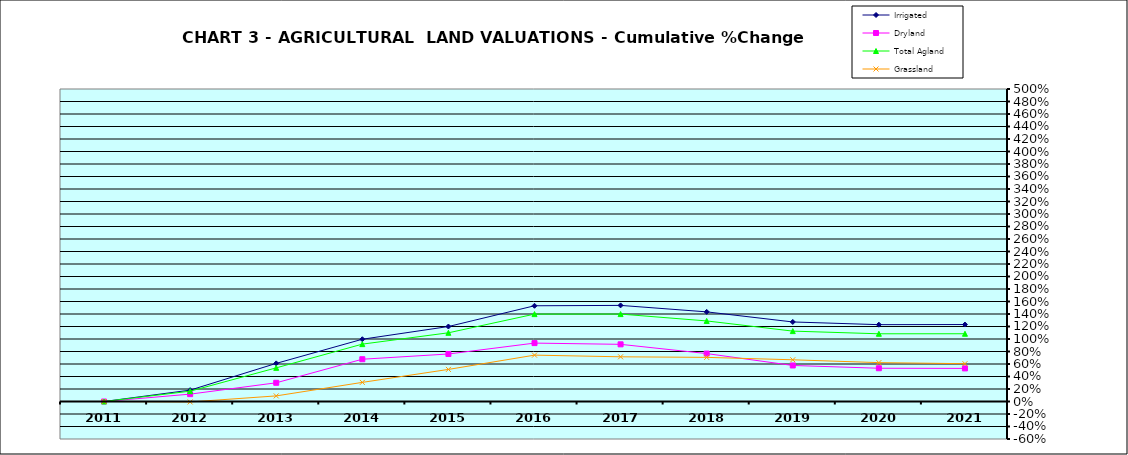
| Category | Irrigated | Dryland | Total Agland | Grassland |
|---|---|---|---|---|
| 2011.0 | 0 | 0 | 0 | 0 |
| 2012.0 | 0.182 | 0.118 | 0.165 | -0.007 |
| 2013.0 | 0.61 | 0.299 | 0.538 | 0.09 |
| 2014.0 | 0.996 | 0.676 | 0.918 | 0.306 |
| 2015.0 | 1.2 | 0.76 | 1.099 | 0.513 |
| 2016.0 | 1.532 | 0.934 | 1.398 | 0.742 |
| 2017.0 | 1.538 | 0.915 | 1.399 | 0.715 |
| 2018.0 | 1.434 | 0.767 | 1.289 | 0.706 |
| 2019.0 | 1.273 | 0.576 | 1.126 | 0.667 |
| 2020.0 | 1.229 | 0.532 | 1.083 | 0.622 |
| 2021.0 | 1.231 | 0.53 | 1.084 | 0.605 |